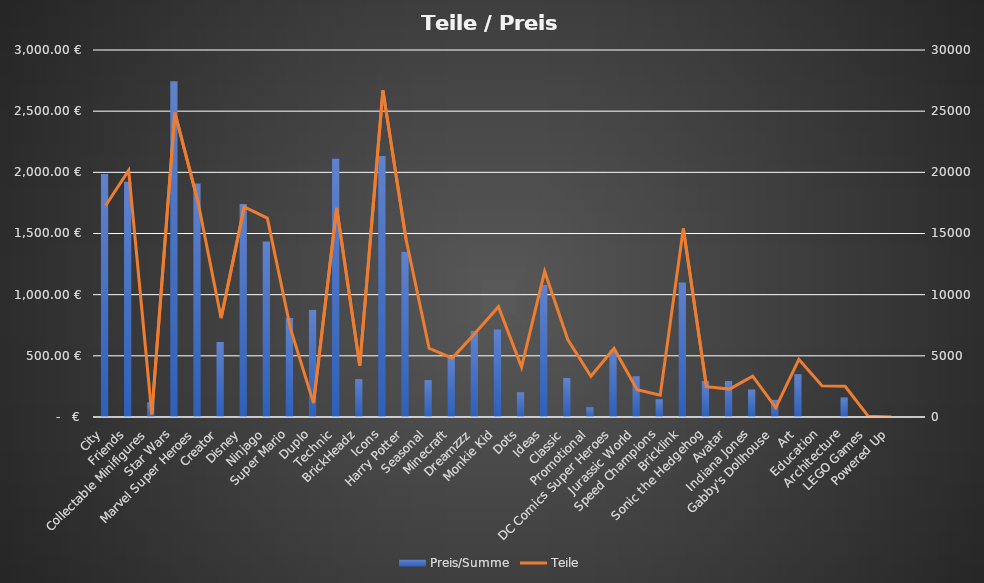
| Category | Preis/Summe |
|---|---|
| City | 1985.57 |
| Friends | 1924.63 |
| Collectable Minifigures | 119.7 |
| Star Wars | 2743.71 |
| Marvel Super Heroes | 1909.73 |
| Creator | 612.84 |
| Disney | 1740.77 |
| Ninjago | 1434.76 |
| Super Mario | 809.76 |
| Duplo | 876.81 |
| Technic | 2112.83 |
| BrickHeadz | 309.83 |
| Icons | 2132.88 |
| Harry Potter | 1352.85 |
| Seasonal | 301.9 |
| Minecraft | 494.89 |
| Dreamzzz | 703.89 |
| Monkie Kid | 715.91 |
| Dots | 202.91 |
| Ideas | 1079.93 |
| Classic | 319.93 |
| Promotional | 79.99 |
| DC Comics Super Heroes | 550.95 |
| Jurassic World | 332.95 |
| Speed Champions | 144.95 |
| Bricklink | 1099.95 |
| Sonic the Hedgehog | 295.95 |
| Avatar | 294.95 |
| Indiana Jones | 224.97 |
| Gabby's Dollhouse | 140.96 |
| Art | 349.97 |
| Education | 0 |
| Architecture | 159.99 |
| LEGO Games | 0 |
| Powered Up | 0 |